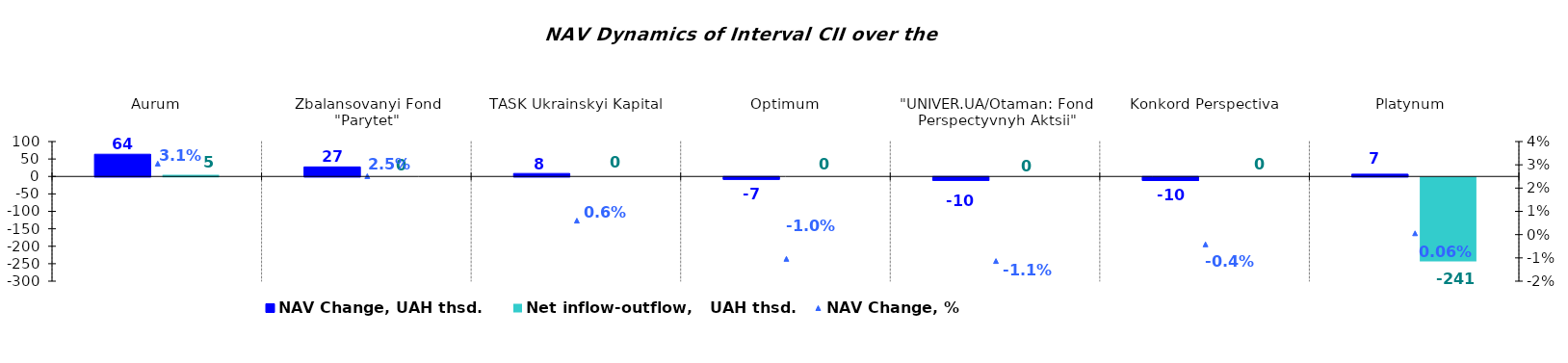
| Category | NAV Change, UAH thsd. | Net inflow-outflow,   UAH thsd. |
|---|---|---|
| Аurum | 63.579 | 4.935 |
| Zbalansovanyi Fond "Parytet" | 27.324 | 0 |
| TASK Ukrainskyi Kapital | 8.498 | 0 |
| Optimum | -6.819 | 0 |
| "UNIVER.UA/Otaman: Fond Perspectyvnyh Aktsii" | -9.848 | 0 |
| Konkord Perspectiva | -10.181 | 0 |
| Platynum  | 6.55 | -240.998 |